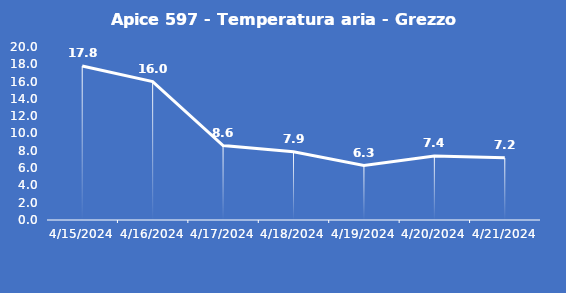
| Category | Apice 597 - Temperatura aria - Grezzo (°C) |
|---|---|
| 4/15/24 | 17.8 |
| 4/16/24 | 16 |
| 4/17/24 | 8.6 |
| 4/18/24 | 7.9 |
| 4/19/24 | 6.3 |
| 4/20/24 | 7.4 |
| 4/21/24 | 7.2 |